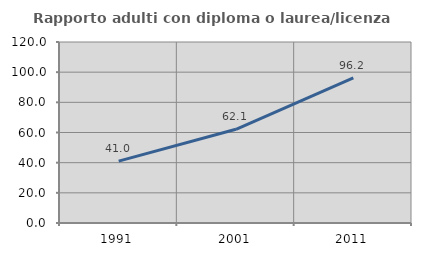
| Category | Rapporto adulti con diploma o laurea/licenza media  |
|---|---|
| 1991.0 | 40.989 |
| 2001.0 | 62.115 |
| 2011.0 | 96.248 |